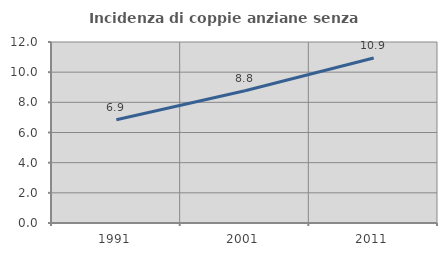
| Category | Incidenza di coppie anziane senza figli  |
|---|---|
| 1991.0 | 6.85 |
| 2001.0 | 8.766 |
| 2011.0 | 10.936 |